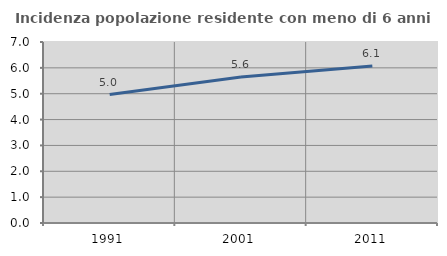
| Category | Incidenza popolazione residente con meno di 6 anni |
|---|---|
| 1991.0 | 4.967 |
| 2001.0 | 5.645 |
| 2011.0 | 6.075 |